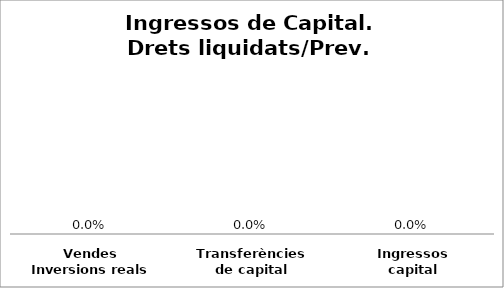
| Category | Series 0 |
|---|---|
| Vendes Inversions reals | 0 |
| Transferències de capital | 0 |
| Ingressos capital | 0 |